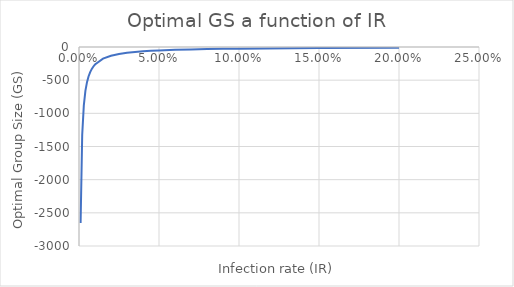
| Category | Series 0 |
|---|---|
| 0.001 | -2652.122 |
| 0.002 | -1325.397 |
| 0.003 | -883.156 |
| 0.004 | -662.035 |
| 0.005 | -529.362 |
| 0.006 | -440.913 |
| 0.007 | -377.736 |
| 0.008 | -330.353 |
| 0.009 | -293.499 |
| 0.01 | -264.016 |
| 0.015 | -175.567 |
| 0.02 | -131.341 |
| 0.025 | -104.806 |
| 0.03 | -87.115 |
| 0.035 | -74.478 |
| 0.04 | -65 |
| 0.045 | -57.629 |
| 0.05 | -51.731 |
| 0.06 | -42.884 |
| 0.07 | -36.564 |
| 0.08 | -31.823 |
| 0.09 | -28.135 |
| 0.1 | -25.184 |
| 0.15 | -16.327 |
| 0.2 | -11.891 |